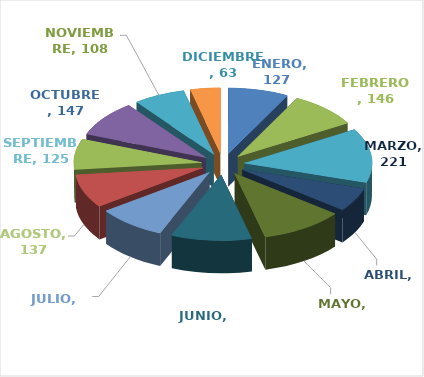
| Category | MANUALES |
|---|---|
|  ENERO | 127 |
| FEBRERO | 146 |
| MARZO | 221 |
| ABRIL | 96 |
| MAYO | 175 |
| JUNIO | 169 |
| JULIO | 144 |
| AGOSTO | 137 |
| SEPTIEMBRE | 125 |
| OCTUBRE | 147 |
| NOVIEMBRE | 108 |
| DICIEMBRE | 63 |